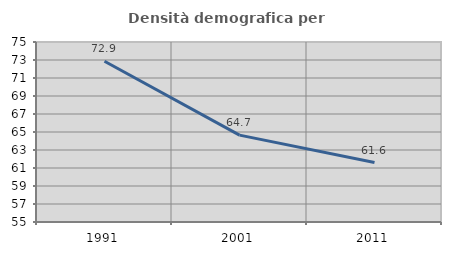
| Category | Densità demografica |
|---|---|
| 1991.0 | 72.867 |
| 2001.0 | 64.651 |
| 2011.0 | 61.605 |